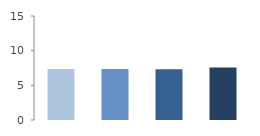
| Category | Rate (%) |
|---|---|
| 2009.0 | 7.354 |
| 2010.0 | 7.371 |
| 2011.0 | 7.324 |
| 2012.0 | 7.585 |